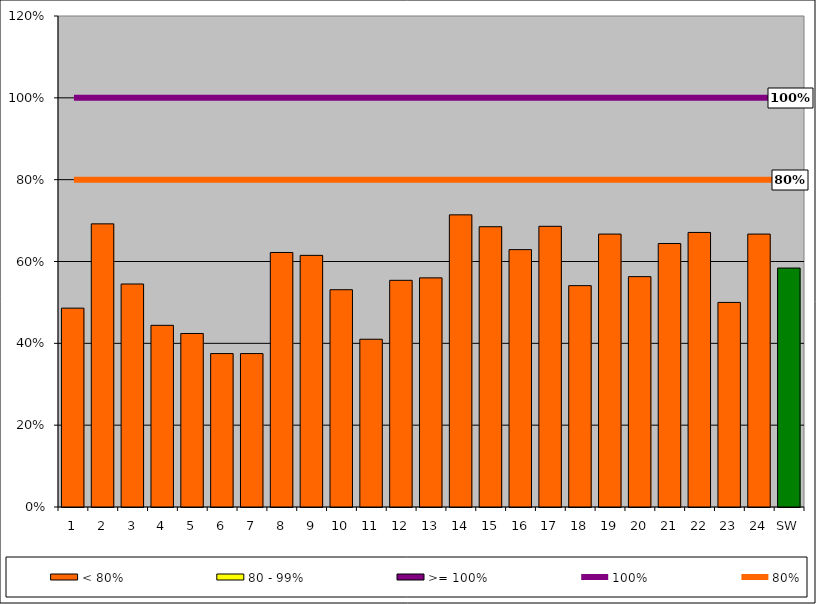
| Category | < 80% | 80 - 99% | >= 100% |
|---|---|---|---|
| 1 | 0.486 | 0 | 0 |
| 2 | 0.692 | 0 | 0 |
| 3 | 0.545 | 0 | 0 |
| 4 | 0.444 | 0 | 0 |
| 5 | 0.424 | 0 | 0 |
| 6 | 0.375 | 0 | 0 |
| 7 | 0.375 | 0 | 0 |
| 8 | 0.622 | 0 | 0 |
| 9 | 0.615 | 0 | 0 |
| 10 | 0.531 | 0 | 0 |
| 11 | 0.41 | 0 | 0 |
| 12 | 0.554 | 0 | 0 |
| 13 | 0.56 | 0 | 0 |
| 14 | 0.714 | 0 | 0 |
| 15 | 0.685 | 0 | 0 |
| 16 | 0.629 | 0 | 0 |
| 17 | 0.686 | 0 | 0 |
| 18 | 0.541 | 0 | 0 |
| 19 | 0.667 | 0 | 0 |
| 20 | 0.563 | 0 | 0 |
| 21 | 0.644 | 0 | 0 |
| 22 | 0.671 | 0 | 0 |
| 23 | 0.5 | 0 | 0 |
| 24 | 0.667 | 0 | 0 |
| SW | 0.584 | 0 | 0 |